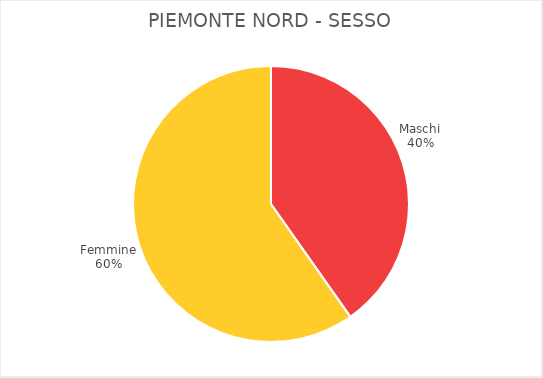
| Category | Piemonte Nord |
|---|---|
| Maschi | 9863 |
| Femmine | 14646 |